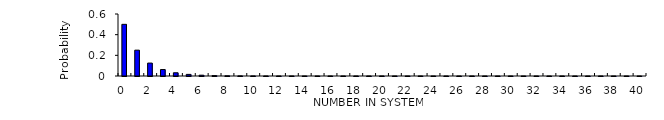
| Category | Series 0 |
|---|---|
| 0.0 | 0.5 |
| 1.0 | 0.25 |
| 2.0 | 0.125 |
| 3.0 | 0.062 |
| 4.0 | 0.031 |
| 5.0 | 0.016 |
| 6.0 | 0.008 |
| 7.0 | 0.004 |
| 8.0 | 0.002 |
| 9.0 | 0.001 |
| 10.0 | 0 |
| 11.0 | 0 |
| 12.0 | 0 |
| 13.0 | 0 |
| 14.0 | 0 |
| 15.0 | 0 |
| 16.0 | 0 |
| 17.0 | 0 |
| 18.0 | 0 |
| 19.0 | 0 |
| 20.0 | 0 |
| 21.0 | 0 |
| 22.0 | 0 |
| 23.0 | 0 |
| 24.0 | 0 |
| 25.0 | 0 |
| 26.0 | 0 |
| 27.0 | 0 |
| 28.0 | 0 |
| 29.0 | 0 |
| 30.0 | 0 |
| 31.0 | 0 |
| 32.0 | 0 |
| 33.0 | 0 |
| 34.0 | 0 |
| 35.0 | 0 |
| 36.0 | 0 |
| 37.0 | 0 |
| 38.0 | 0 |
| 39.0 | 0 |
| 40.0 | 0 |